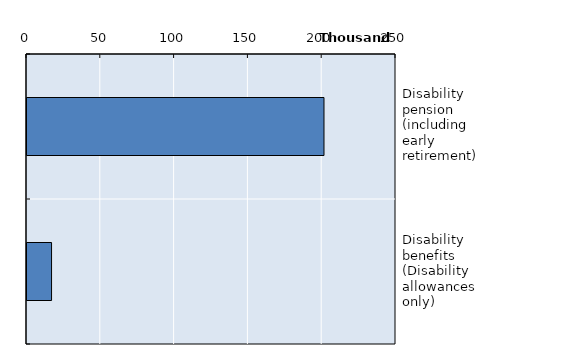
| Category | Series 0 |
|---|---|
| Disability pension (including early retirement) | 201216 |
| Disability benefits (Disability allowances only) | 16636 |